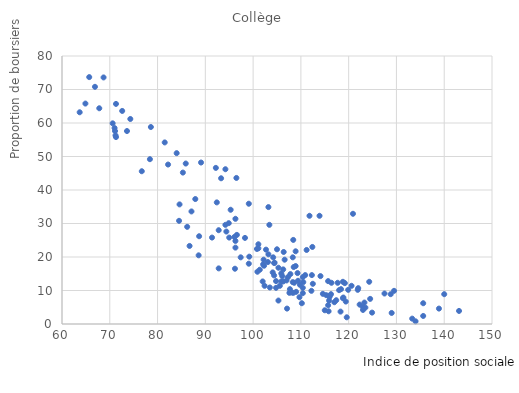
| Category | Bours. CLG |
|---|---|
| 121.9 | 10.2 |
| 112.5 | 12 |
| 109.4 | 12.9 |
| 84.6 | 35.7 |
| 74.3 | 61.2 |
| 86.7 | 23.3 |
| 107.8 | 14.9 |
| 96.2 | 16.5 |
| 116.3 | 8.9 |
| 119.9 | 10.2 |
| 120.6 | 11.4 |
| 110.5 | 12.5 |
| 101.1 | 23.8 |
| 102.1 | 17.8 |
| 112.2 | 9.9 |
| 117.0 | 6.5 |
| 111.2 | 22.1 |
| 108.5 | 17 |
| 116.4 | 12.3 |
| 112.3 | 14.6 |
| 114.6 | 9 |
| 124.9 | 3.4 |
| 86.2 | 29 |
| 94.4 | 27.6 |
| 123.0 | 4.2 |
| 104.4 | 14.5 |
| 118.9 | 7.9 |
| 117.4 | 7.1 |
| 116.0 | 8.4 |
| 108.4 | 25.1 |
| 103.4 | 29.6 |
| 104.5 | 18.3 |
| 110.4 | 10.8 |
| 92.4 | 36.3 |
| 96.3 | 31.4 |
| 102.0 | 12.7 |
| 122.3 | 5.8 |
| 108.1 | 9.4 |
| 107.1 | 4.6 |
| 102.3 | 17.4 |
| 115.7 | 12.8 |
| 107.3 | 14 |
| 108.3 | 19.9 |
| 104.1 | 15.4 |
| 106.1 | 14.3 |
| 110.9 | 14.6 |
| 122.0 | 10.7 |
| 82.2 | 47.6 |
| 129.5 | 9.9 |
| 95.0 | 25.8 |
| 105.9 | 12.7 |
| 123.3 | 6.4 |
| 96.6 | 26.6 |
| 100.8 | 22.4 |
| 106.4 | 21.5 |
| 85.3 | 45.2 |
| 84.0 | 51 |
| 100.9 | 15.6 |
| 107.0 | 13 |
| 106.6 | 19.2 |
| 94.2 | 29.6 |
| 104.8 | 10.8 |
| 105.0 | 22.3 |
| 109.0 | 9.6 |
| 105.6 | 11.4 |
| 71.1 | 57.6 |
| 92.2 | 46.6 |
| 78.6 | 58.8 |
| 71.0 | 58.5 |
| 94.2 | 46.2 |
| 99.1 | 35.9 |
| 127.5 | 9.1 |
| 138.9 | 4.6 |
| 117.7 | 12.3 |
| 71.2 | 56.3 |
| 63.7 | 63.2 |
| 96.5 | 43.6 |
| 68.7 | 73.6 |
| 71.3 | 65.7 |
| 113.9 | 32.3 |
| 111.8 | 32.3 |
| 120.9 | 32.9 |
| 85.9 | 47.9 |
| 93.3 | 43.5 |
| 135.6 | 6.2 |
| 119.2 | 12.2 |
| 140.0 | 8.9 |
| 143.1 | 3.9 |
| 72.6 | 63.6 |
| 119.4 | 6.7 |
| 108.4 | 9.3 |
| 122.9 | 5.2 |
| 118.8 | 12.6 |
| 114.1 | 14.3 |
| 115.7 | 5.6 |
| 105.9 | 15.1 |
| 124.5 | 7.5 |
| 104.8 | 12.8 |
| 104.2 | 19.9 |
| 105.3 | 16.8 |
| 103.5 | 10.9 |
| 102.2 | 19.2 |
| 133.3 | 1.6 |
| 89.1 | 48.2 |
| 99.2 | 20.1 |
| 118.8 | 7.7 |
| 103.2 | 20.8 |
| 76.7 | 45.6 |
| 64.9 | 65.8 |
| 112.4 | 23 |
| 116.0 | 8.1 |
| 128.8 | 8.9 |
| 102.7 | 22.2 |
| 108.3 | 12.5 |
| 107.7 | 10.4 |
| 104.4 | 18.2 |
| 105.3 | 7 |
| 110.2 | 6.2 |
| 115.9 | 7 |
| 98.3 | 25.7 |
| 108.6 | 12.3 |
| 118.3 | 3.7 |
| 107.6 | 9.3 |
| 115.3 | 8.6 |
| 87.9 | 37.3 |
| 78.4 | 49.2 |
| 108.9 | 21.7 |
| 119.6 | 2 |
| 118.4 | 10.4 |
| 91.4 | 25.8 |
| 134.0 | 0.8 |
| 95.3 | 34.1 |
| 109.8 | 11.7 |
| 73.6 | 57.6 |
| 66.9 | 70.8 |
| 70.6 | 59.9 |
| 110.4 | 14 |
| 71.3 | 55.8 |
| 65.7 | 73.7 |
| 67.8 | 64.4 |
| 124.3 | 12.6 |
| 81.5 | 54.2 |
| 106.3 | 16.3 |
| 106.3 | 12.7 |
| 110.4 | 9.2 |
| 87.1 | 33.6 |
| 109.7 | 8 |
| 94.9 | 30.1 |
| 103.2 | 34.9 |
| 123.5 | 4.9 |
| 97.4 | 19.9 |
| 115.0 | 4.1 |
| 118.0 | 10.1 |
| 103.1 | 18.5 |
| 88.6 | 20.5 |
| 84.5 | 30.8 |
| 88.7 | 26.2 |
| 102.4 | 11.4 |
| 115.8 | 3.8 |
| 108.9 | 17.3 |
| 96.1 | 26 |
| 101.1 | 22.6 |
| 101.4 | 16.2 |
| 92.8 | 16.6 |
| 109.3 | 15.2 |
| 99.1 | 18 |
| 96.3 | 24.8 |
| 96.3 | 22.8 |
| 92.8 | 28 |
| 135.6 | 2.4 |
| 129.0 | 3.3 |